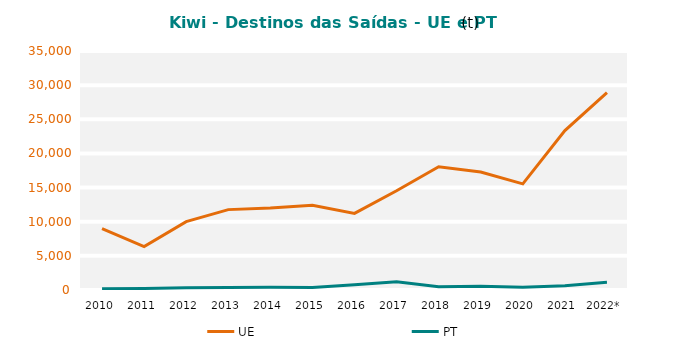
| Category | UE | PT |
|---|---|---|
| 2010 | 8988.005 | 186.802 |
| 2011 | 6355.855 | 224.15 |
| 2012 | 10015.63 | 323.321 |
| 2013 | 11771.288 | 369.651 |
| 2014 | 12024.679 | 387.584 |
| 2015 | 12424.985 | 365.639 |
| 2016 | 11214.35 | 785.62 |
| 2017 | 14535.694 | 1215.058 |
| 2018 | 18045.752 | 477.726 |
| 2019 | 17279.011 | 536.201 |
| 2020 | 15544.321 | 387.072 |
| 2021 | 23347.624 | 630.414 |
| 2022* | 28917.705 | 1129.917 |